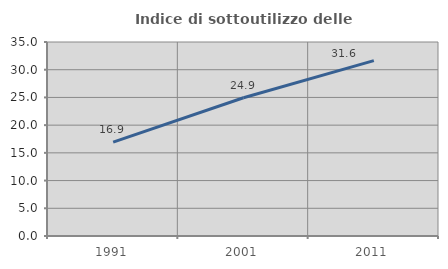
| Category | Indice di sottoutilizzo delle abitazioni  |
|---|---|
| 1991.0 | 16.95 |
| 2001.0 | 24.947 |
| 2011.0 | 31.643 |